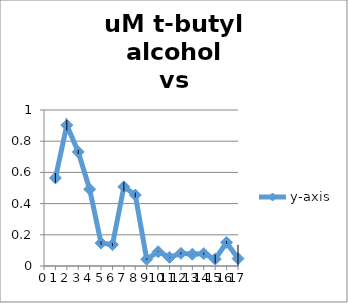
| Category | y-axis |
|---|---|
| 1.0 | 0.564 |
| 2.0 | 0.903 |
| 3.0 | 0.731 |
| 4.0 | 0.493 |
| 5.0 | 0.147 |
| 6.0 | 0.137 |
| 7.0 | 0.508 |
| 8.0 | 0.455 |
| 9.0 | 0.043 |
| 10.0 | 0.092 |
| 11.0 | 0.055 |
| 12.0 | 0.081 |
| 13.0 | 0.076 |
| 14.0 | 0.079 |
| 15.0 | 0.044 |
| 16.0 | 0.151 |
| 17.0 | 0.048 |